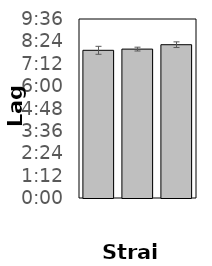
| Category | Time to Vmax (hh:mm:ss) |
|---|---|
| 0 | 0.33 |
| 1 | 0.333 |
| 2 | 0.343 |